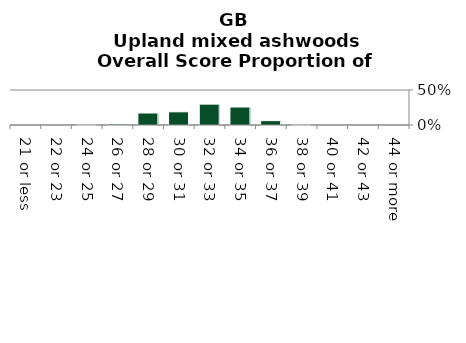
| Category | Upland mixed ashwoods |
|---|---|
| 21 or less | 0 |
| 22 or 23 | 0 |
| 24 or 25 | 0.004 |
| 26 or 27 | 0.014 |
| 28 or 29 | 0.171 |
| 30 or 31 | 0.188 |
| 32 or 33 | 0.298 |
| 34 or 35 | 0.257 |
| 36 or 37 | 0.062 |
| 38 or 39 | 0.004 |
| 40 or 41 | 0 |
| 42 or 43 | 0 |
| 44 or more | 0 |